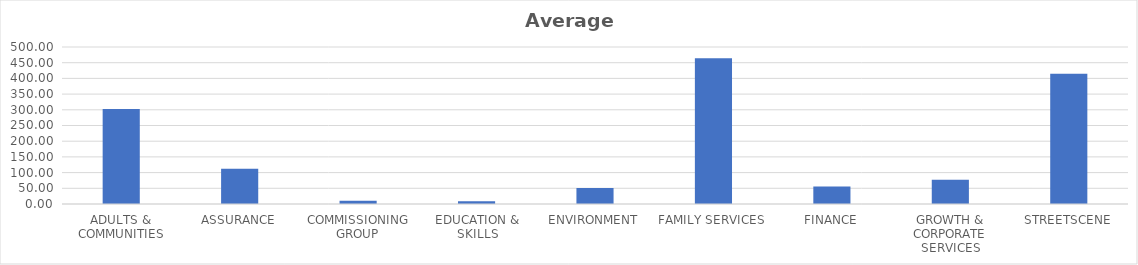
| Category | Average FTE |
|---|---|
| ADULTS & COMMUNITIES | 302.863 |
| ASSURANCE | 112.06 |
| COMMISSIONING GROUP | 10.25 |
| EDUCATION & SKILLS | 8.989 |
| ENVIRONMENT | 51.284 |
| FAMILY SERVICES | 464.259 |
| FINANCE | 55.351 |
| GROWTH & CORPORATE SERVICES | 77.071 |
| STREETSCENE | 414.92 |